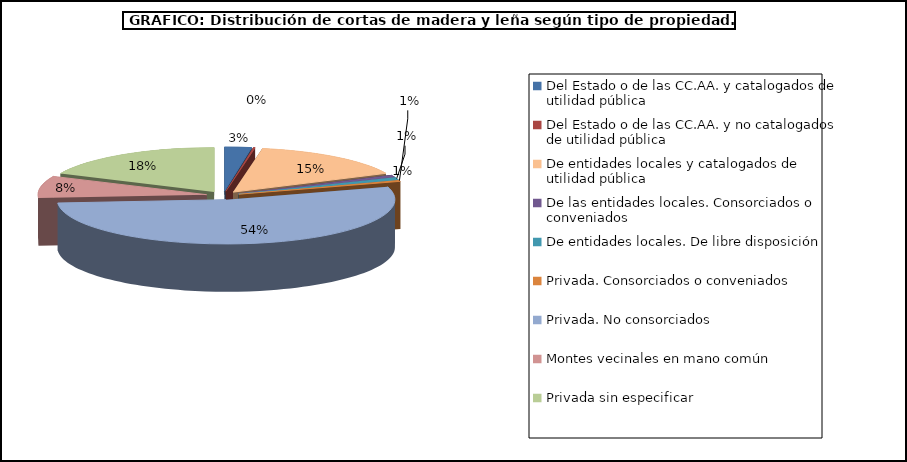
| Category | Series 0 |
|---|---|
| Del Estado o de las CC.AA. y catalogados de utilidad pública | 406356.68 |
| Del Estado o de las CC.AA. y no catalogados de utilidad pública | 30725.47 |
| De entidades locales y catalogados de utilidad pública | 2403996.68 |
| De las entidades locales. Consorciados o conveniados | 130390.73 |
| De entidades locales. De libre disposición | 145040.86 |
| Privada. Consorciados o conveniados | 82631.23 |
| Privada. No consorciados | 8433736.906 |
| Montes vecinales en mano común | 1262080 |
| Privada sin especificar | 2866931.65 |